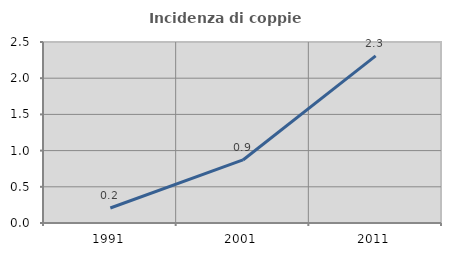
| Category | Incidenza di coppie miste |
|---|---|
| 1991.0 | 0.207 |
| 2001.0 | 0.871 |
| 2011.0 | 2.309 |